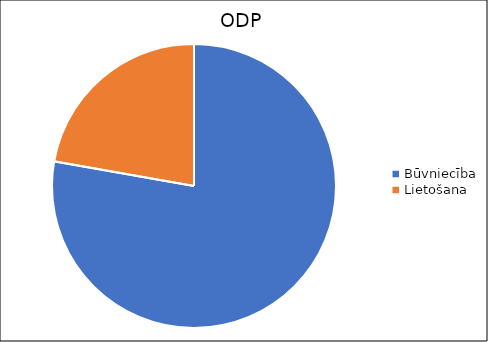
| Category | Būvniecība |
|---|---|
| Būvniecība | 0.014 |
| Lietošana | 0.004 |